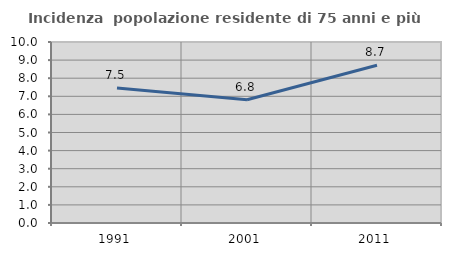
| Category | Incidenza  popolazione residente di 75 anni e più |
|---|---|
| 1991.0 | 7.452 |
| 2001.0 | 6.808 |
| 2011.0 | 8.713 |